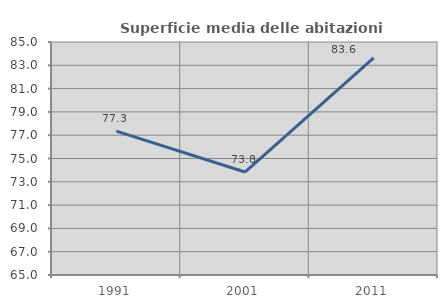
| Category | Superficie media delle abitazioni occupate |
|---|---|
| 1991.0 | 77.344 |
| 2001.0 | 73.838 |
| 2011.0 | 83.64 |